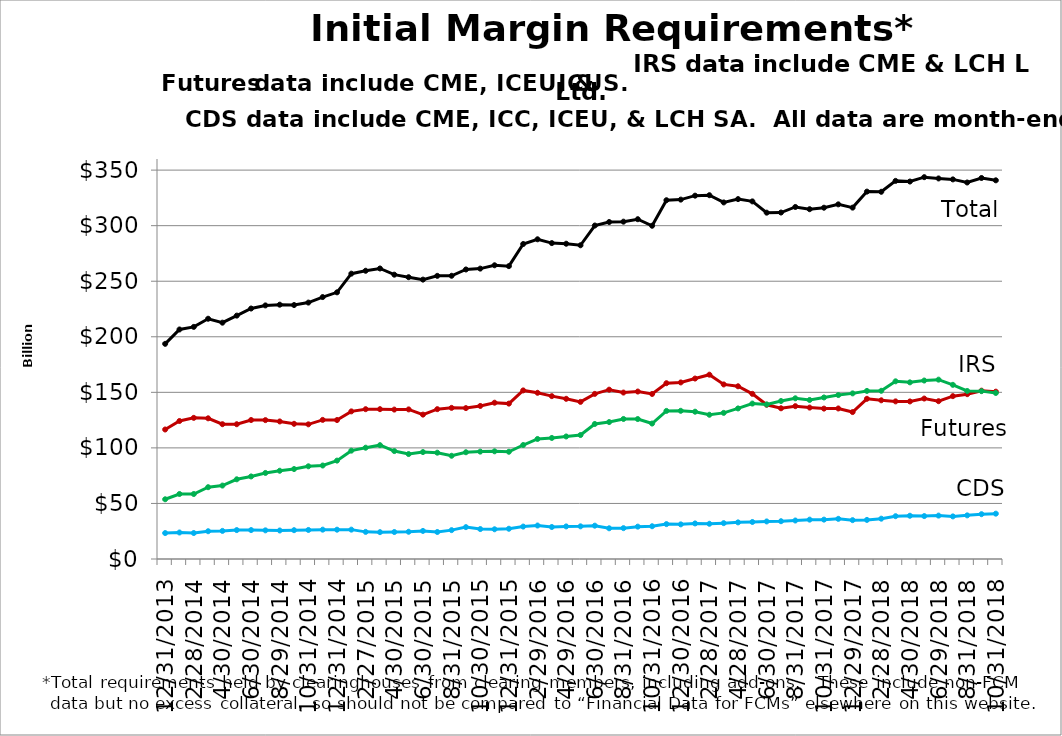
| Category | CDS | Futures | IRS | Total |
|---|---|---|---|---|
| 2013-12-31 |  |  |  |  |
| nan |  |  |  |  |
| 2014-02-28 |  |  |  |  |
| nan |  |  |  |  |
| 2014-04-30 |  |  |  |  |
| nan |  |  |  |  |
| 2014-06-30 |  |  |  |  |
| nan |  |  |  |  |
| 2014-08-29 |  |  |  |  |
| nan |  |  |  |  |
| 2014-10-31 |  |  |  |  |
| nan |  |  |  |  |
| 2014-12-31 |  |  |  |  |
| nan |  |  |  |  |
| 2015-02-27 |  |  |  |  |
| nan |  |  |  |  |
| 2015-04-30 |  |  |  |  |
| nan |  |  |  |  |
| 2015-06-30 |  |  |  |  |
| nan |  |  |  |  |
| 2015-08-31 |  |  |  |  |
| nan |  |  |  |  |
| 2015-10-30 |  |  |  |  |
| nan |  |  |  |  |
| 2015-12-31 |  |  |  |  |
| nan |  |  |  |  |
| 2016-02-29 |  |  |  |  |
| nan |  |  |  |  |
| 2016-04-29 |  |  |  |  |
| nan |  |  |  |  |
| 2016-06-30 |  |  |  |  |
| nan |  |  |  |  |
| 2016-08-31 |  |  |  |  |
| nan |  |  |  |  |
| 2016-10-31 |  |  |  |  |
| nan |  |  |  |  |
| 2016-12-30 |  |  |  |  |
| nan |  |  |  |  |
| 2017-02-28 |  |  |  |  |
| nan |  |  |  |  |
| 2017-04-28 |  |  |  |  |
| nan |  |  |  |  |
| 2017-06-30 |  |  |  |  |
| nan |  |  |  |  |
| 2017-08-31 |  |  |  |  |
| nan |  |  |  |  |
| 2017-10-31 |  |  |  |  |
| nan |  |  |  |  |
| 2017-12-29 |  |  |  |  |
| nan |  |  |  |  |
| 2018-02-28 |  |  |  |  |
| nan |  |  |  |  |
| 2018-04-30 |  |  |  |  |
| nan |  |  |  |  |
| 2018-06-29 |  |  |  |  |
| nan |  |  |  |  |
| 2018-08-31 |  |  |  |  |
| nan |  |  |  |  |
| 2018-10-31 |  |  |  |  |